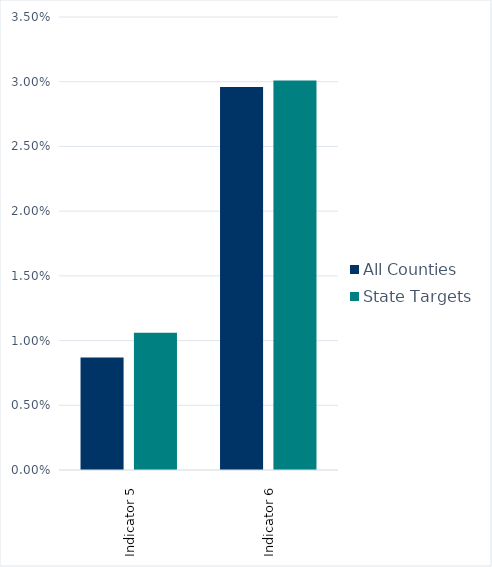
| Category | All Counties | State Targets |
|---|---|---|
| Indicator 5 | 0.009 | 0.011 |
| Indicator 6 | 0.03 | 0.03 |